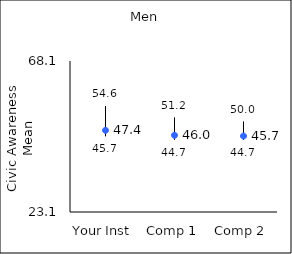
| Category | 25th percentile | 75th percentile | Mean |
|---|---|---|---|
| Your Inst | 45.7 | 54.6 | 47.44 |
| Comp 1 | 44.7 | 51.2 | 45.97 |
| Comp 2 | 44.7 | 50 | 45.74 |